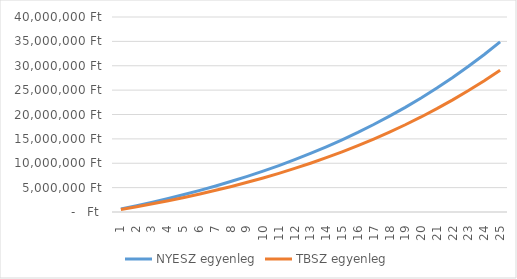
| Category | NYESZ egyenleg | TBSZ egyenleg |
|---|---|---|
| 1.0 | 636000 | 530000 |
| 2.0 | 1310160 | 1091800 |
| 3.0 | 2024769.6 | 1687308 |
| 4.0 | 2782255.776 | 2318546.48 |
| 5.0 | 3585191.123 | 2987659.269 |
| 6.0 | 4436302.59 | 3696918.825 |
| 7.0 | 5338480.745 | 4448733.954 |
| 8.0 | 6294789.59 | 5245657.992 |
| 9.0 | 7308476.965 | 6090397.471 |
| 10.0 | 8382985.583 | 6985821.319 |
| 11.0 | 9521964.718 | 7934970.599 |
| 12.0 | 10729282.601 | 8941068.835 |
| 13.0 | 12009039.558 | 10007532.965 |
| 14.0 | 13365581.931 | 11137984.942 |
| 15.0 | 14803516.847 | 12336264.039 |
| 16.0 | 16327727.858 | 13606439.881 |
| 17.0 | 17943391.529 | 14952826.274 |
| 18.0 | 19655995.021 | 16379995.851 |
| 19.0 | 21471354.722 | 17892795.602 |
| 20.0 | 23395636.005 | 19496363.338 |
| 21.0 | 25435374.166 | 21196145.138 |
| 22.0 | 27597496.616 | 22997913.846 |
| 23.0 | 29889346.413 | 24907788.677 |
| 24.0 | 32318707.197 | 26932255.998 |
| 25.0 | 34893829.629 | 29078191.358 |